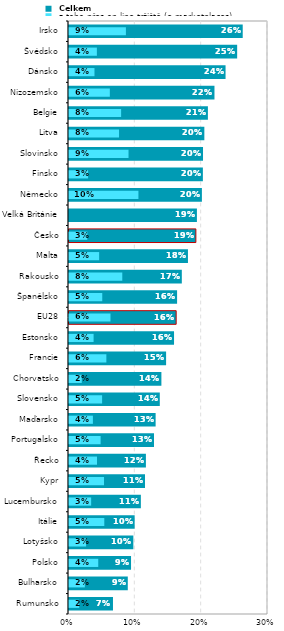
| Category |  Celkem |
|---|---|
| Rumunsko | 0.066 |
| Bulharsko | 0.089 |
| Polsko | 0.094 |
| Lotyšsko | 0.097 |
| Itálie | 0.099 |
| Lucembursko | 0.108 |
| Kypr | 0.115 |
| Řecko | 0.116 |
| Portugalsko | 0.128 |
| Maďarsko | 0.131 |
| Slovensko | 0.137 |
| Chorvatsko | 0.139 |
| Francie | 0.146 |
| Estonsko | 0.158 |
| EU28 | 0.162 |
| Španělsko | 0.163 |
| Rakousko | 0.17 |
| Malta | 0.179 |
| Česko | 0.191 |
| Velká Británie | 0.193 |
| Německo | 0.2 |
| Finsko | 0.202 |
| Slovinsko | 0.202 |
| Litva | 0.204 |
| Belgie | 0.209 |
| Nizozemsko | 0.219 |
| Dánsko | 0.236 |
| Švédsko | 0.254 |
| Irsko | 0.262 |